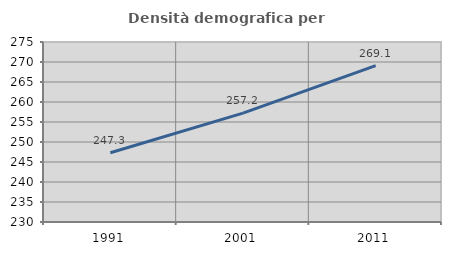
| Category | Densità demografica |
|---|---|
| 1991.0 | 247.327 |
| 2001.0 | 257.209 |
| 2011.0 | 269.111 |